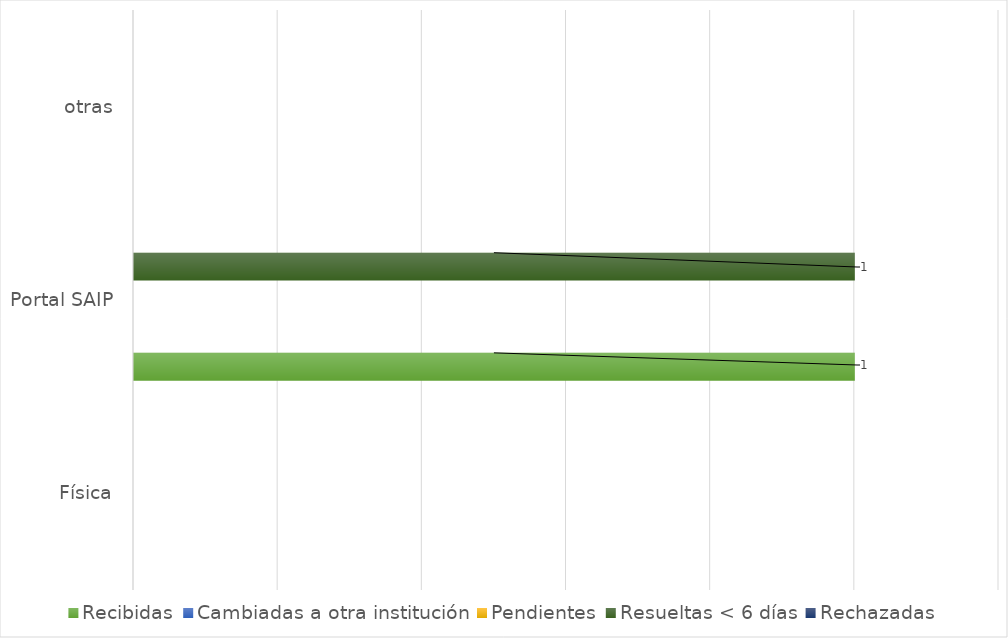
| Category | Recibidas | Cambiadas a otra institución | Pendientes | Resueltas < 6 días | Rechazadas |
|---|---|---|---|---|---|
| Física | 0 | 0 | 0 | 0 | 0 |
| Portal SAIP | 1 | 0 | 0 | 1 | 0 |
| otras | 0 | 0 | 0 | 0 | 0 |